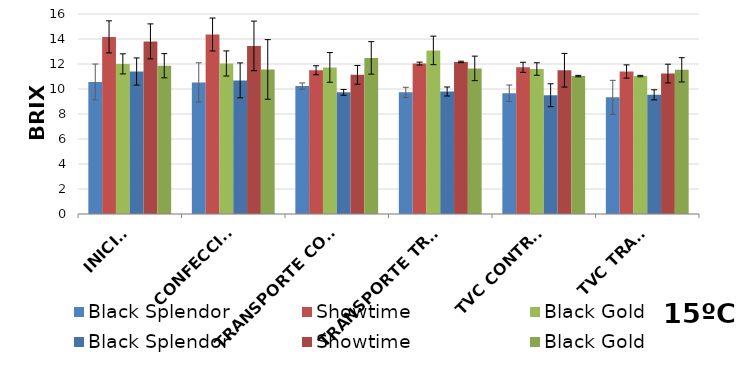
| Category | Black Splendor | Showtime | Black Gold |
|---|---|---|---|
| INICIAL | 11.4 | 13.81 | 11.863 |
| CONFECCIÓN | 10.69 | 13.447 | 11.567 |
|  TRANSPORTE CONTROL | 9.733 | 11.133 | 12.488 |
| TRANSPORTE TRAT. | 9.8 | 12.167 | 11.647 |
| TVC CONTROL | 9.5 | 11.5 | 11.033 |
| TVC TRAT. | 9.533 | 11.233 | 11.533 |